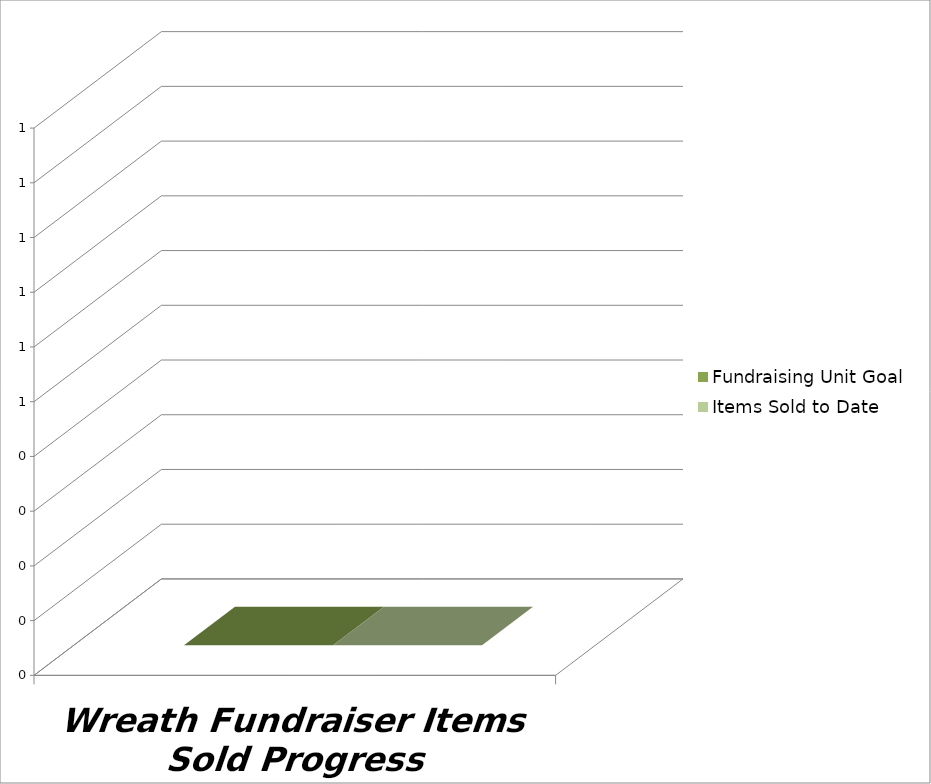
| Category | Fundraising Unit Goal | Items Sold to Date |
|---|---|---|
| 0 | 0 | 0 |